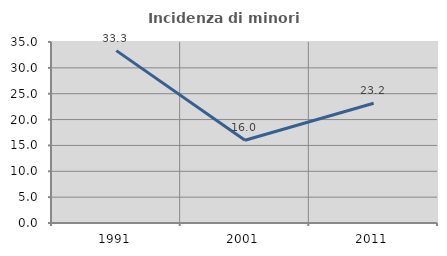
| Category | Incidenza di minori stranieri |
|---|---|
| 1991.0 | 33.333 |
| 2001.0 | 16 |
| 2011.0 | 23.158 |